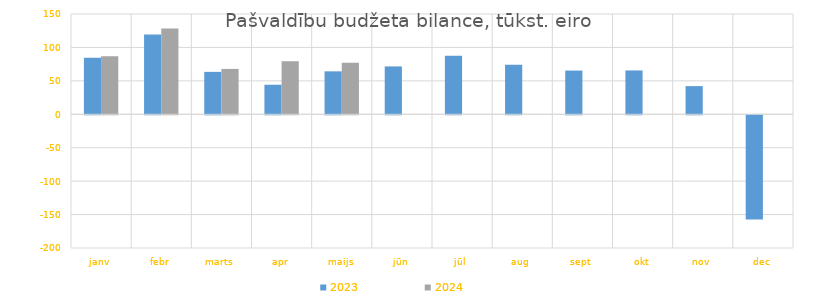
| Category | 2023 | 2024 |
|---|---|---|
| janv | 84479.098 | 86956.73 |
| febr | 119462.892 | 128177.757 |
| marts | 63449.124 | 67846.929 |
| apr | 44164.06 | 79179.795 |
| maijs | 64247.066 | 77228.068 |
| jūn | 71601.894 | 0 |
| jūl | 87551.97 | 0 |
| aug | 74225.888 | 0 |
| sept | 65410.327 | 0 |
| okt | 65576.429 | 0 |
| nov | 42139.59 | 0 |
| dec | -156000.116 | 0 |